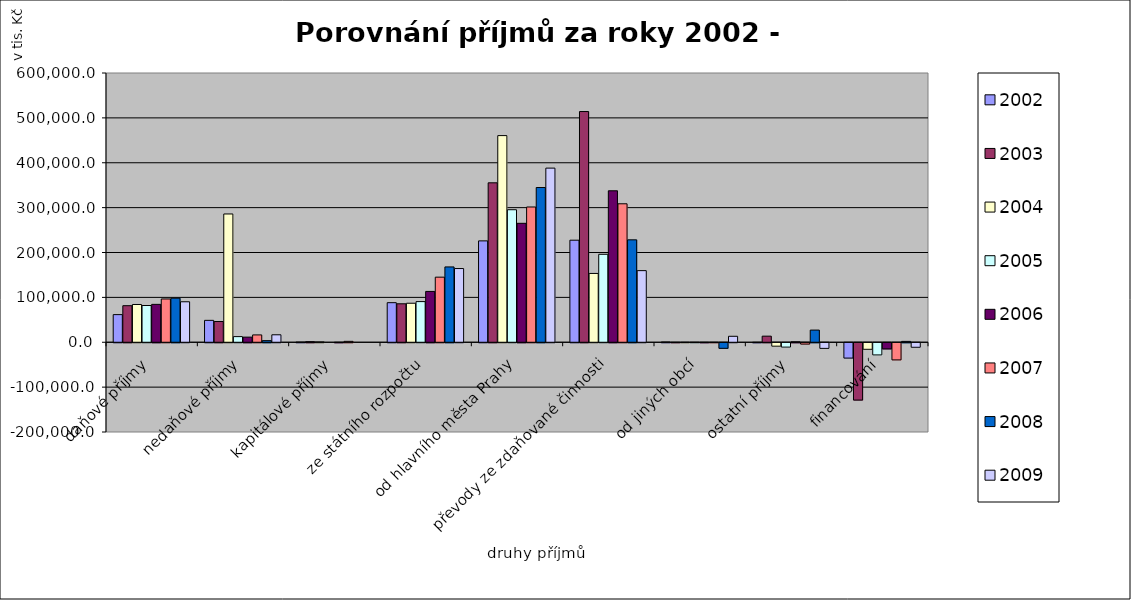
| Category | 2002 | 2003 | 2004 | 2005 | 2006 | 2007 | 2008 | 2009 |
|---|---|---|---|---|---|---|---|---|
| daňové příjmy | 61594.6 | 81470.5 | 84151.5 | 81863.4 | 84411.2 | 96453.1 | 98205.1 | 90196.6 |
| nedaňové příjmy | 48807.2 | 46197 | 285835.3 | 12535 | 11396.9 | 16332.1 | 3566.2 | 16632 |
| kapitálové příjmy | 409.9 | 1350 | 735.8 | 0 | 50 | 2000 | 0 | 0 |
| ze státního rozpočtu | 88175.4 | 85703.3 | 86939.6 | 90564.7 | 113260.8 | 145041.3 | 167830.1 | 164255.4 |
| od hlavního města Prahy | 225873.4 | 355264.6 | 460508.4 | 295325.6 | 265018.8 | 301416.8 | 344799.7 | 388036.8 |
| převody ze zdaňované činnosti | 227406.2 | 514118.7 | 153331.7 | 195990.3 | 337520.2 | 308534.2 | 228210.2 | 159586 |
| od jiných obcí | 543.6 | 68.3 | 68.6 | 74.4 | 75.9 | 35.6 | -12406.2 | 13277.9 |
| ostatní příjmy | -200 | 13578.3 | -7634.4 | -9699.3 | 1026 | -2990.7 | 27100 | -12558 |
| financování | -34186.3 | -127716.8 | -14598.6 | -27102.4 | -13713.5 | -38226.5 | 1942 | -10067.9 |